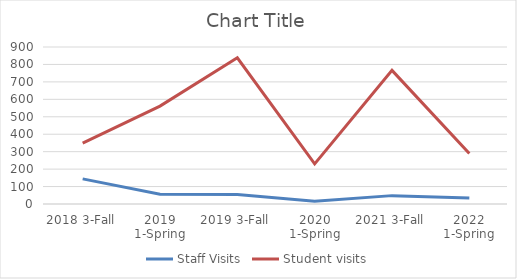
| Category | Staff Visits | Student visits |
|---|---|---|
| 2018 3-Fall | 144 | 349 |
| 2019 1-Spring | 56 | 561 |
| 2019 3-Fall | 55 | 838 |
| 2020 1-Spring | 16 | 230 |
| 2021 3-Fall | 48 | 766 |
| 2022 1-Spring | 35 | 290 |